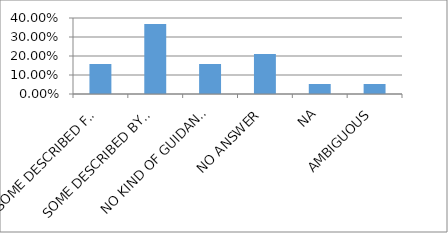
| Category | Series 0 |
|---|---|
| SOME DESCRIBED FOR TGICA | 0.158 |
| SOME DESCRIBED BY OTHER THAN TGICA | 0.368 |
| NO KIND OF GUIDANCE BY TGICA | 0.158 |
| NO ANSWER | 0.211 |
| NA | 0.053 |
| AMBIGUOUS | 0.053 |